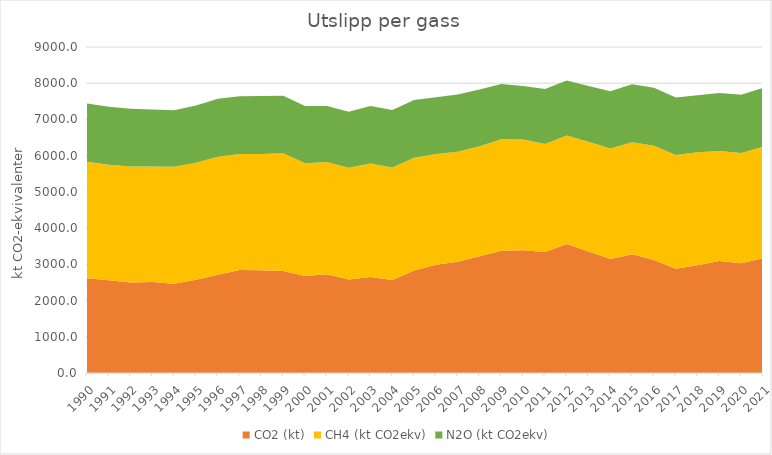
| Category | CO2 (kt) | CH4 (kt CO2ekv) | N2O (kt CO2ekv) |
|---|---|---|---|
| 1990.0 | 2612.498 | 3221.915 | 1608.648 |
| 1991.0 | 2559.146 | 3189.174 | 1602.985 |
| 1992.0 | 2498.084 | 3200.805 | 1595.818 |
| 1993.0 | 2514.926 | 3182.946 | 1578.708 |
| 1994.0 | 2466.157 | 3227.526 | 1562.909 |
| 1995.0 | 2576.079 | 3228.956 | 1578.802 |
| 1996.0 | 2714.017 | 3258.376 | 1598.207 |
| 1997.0 | 2845.819 | 3202.925 | 1592.948 |
| 1998.0 | 2837.618 | 3207.766 | 1601.223 |
| 1999.0 | 2814.926 | 3253.424 | 1584.655 |
| 2000.0 | 2674.675 | 3114.092 | 1580.254 |
| 2001.0 | 2726.097 | 3096.978 | 1548.311 |
| 2002.0 | 2580.06 | 3084.142 | 1546.505 |
| 2003.0 | 2647.196 | 3137.166 | 1584.38 |
| 2004.0 | 2565.923 | 3104.636 | 1591.006 |
| 2005.0 | 2828.247 | 3117.677 | 1589.882 |
| 2006.0 | 2991.329 | 3054.474 | 1567.287 |
| 2007.0 | 3070.822 | 3034.777 | 1581.086 |
| 2008.0 | 3222.269 | 3035.528 | 1568.165 |
| 2009.0 | 3374.967 | 3077.096 | 1526.021 |
| 2010.0 | 3386.042 | 3059.933 | 1478.655 |
| 2011.0 | 3341.032 | 2983.433 | 1514.174 |
| 2012.0 | 3562.974 | 2994.679 | 1520.018 |
| 2013.0 | 3357.415 | 3025.29 | 1539.223 |
| 2014.0 | 3147.641 | 3049.554 | 1579.695 |
| 2015.0 | 3277.051 | 3095.932 | 1601.148 |
| 2016.0 | 3119.73 | 3155.875 | 1600.383 |
| 2017.0 | 2876.61 | 3144.261 | 1582.935 |
| 2018.0 | 2971.924 | 3125.229 | 1571.564 |
| 2019.0 | 3088.76 | 3037.686 | 1605.082 |
| 2020.0 | 3032.763 | 3039.896 | 1607.257 |
| 2021.0 | 3167.28 | 3082.469 | 1623.624 |